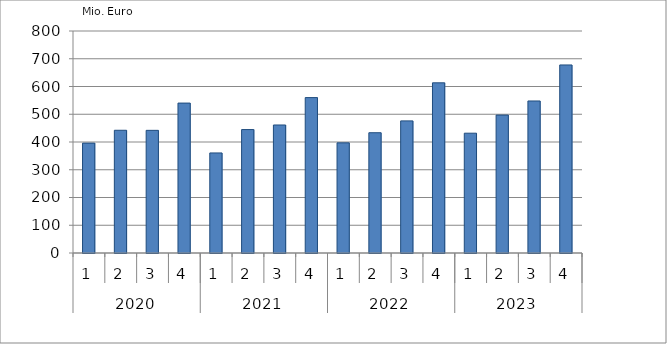
| Category | Ausbaugewerblicher Umsatz3 |
|---|---|
| 0 | 395996.128 |
| 1 | 442270.528 |
| 2 | 441987.109 |
| 3 | 540250.513 |
| 4 | 360578.959 |
| 5 | 444796.964 |
| 6 | 461290.095 |
| 7 | 559989.337 |
| 8 | 396959.135 |
| 9 | 433420.546 |
| 10 | 476099.112 |
| 11 | 613244.901 |
| 12 | 431755.233 |
| 13 | 497030.878 |
| 14 | 547817.6 |
| 15 | 677619.257 |